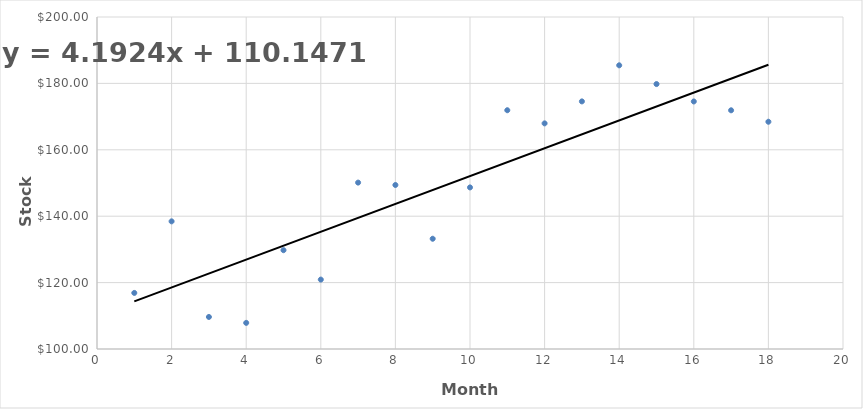
| Category | Series 0 |
|---|---|
| 1.0 | 116.89 |
| 2.0 | 138.45 |
| 3.0 | 109.65 |
| 4.0 | 107.87 |
| 5.0 | 129.76 |
| 6.0 | 120.91 |
| 7.0 | 150.12 |
| 8.0 | 149.4 |
| 9.0 | 133.21 |
| 10.0 | 148.67 |
| 11.0 | 171.92 |
| 12.0 | 167.96 |
| 13.0 | 174.58 |
| 14.0 | 185.45 |
| 15.0 | 179.8 |
| 16.0 | 174.56 |
| 17.0 | 171.9 |
| 18.0 | 168.45 |